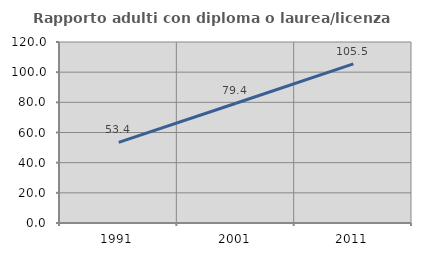
| Category | Rapporto adulti con diploma o laurea/licenza media  |
|---|---|
| 1991.0 | 53.416 |
| 2001.0 | 79.386 |
| 2011.0 | 105.469 |